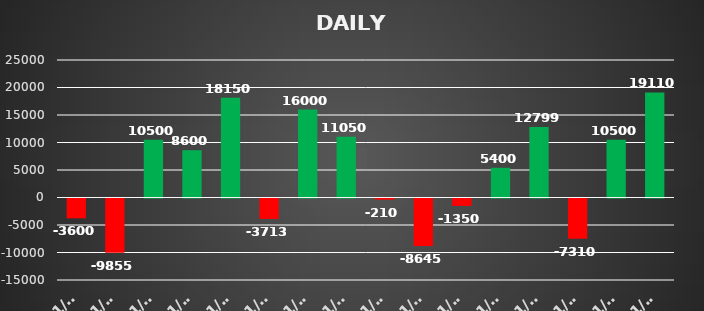
| Category | Series 0 |
|---|---|
| 2022-01-04 | -3600 |
| 2022-01-05 | -9855 |
| 2022-01-06 | 10500 |
| 2022-01-07 | 8600 |
| 2022-01-10 | 18150 |
| 2022-01-11 | -3712.5 |
| 2022-01-12 | 16000 |
| 2022-01-13 | 11050 |
| 2022-01-14 | -210 |
| 2022-01-17 | -8645 |
| 2022-01-18 | -1350 |
| 2022-01-19 | 5400 |
| 2022-01-20 | 12799.2 |
| 2022-01-24 | -7310 |
| 2022-01-28 | 10500 |
| 2022-01-31 | 19110 |